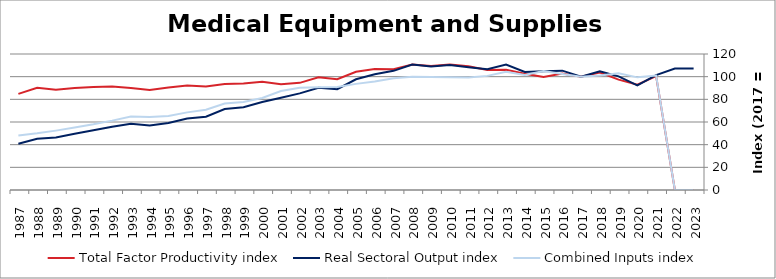
| Category | Total Factor Productivity index | Real Sectoral Output index | Combined Inputs index |
|---|---|---|---|
| 2023.0 | 0 | 107.106 | 0 |
| 2022.0 | 0 | 107.158 | 0 |
| 2021.0 | 100.472 | 101.427 | 100.951 |
| 2020.0 | 92.863 | 92.293 | 99.386 |
| 2019.0 | 97.391 | 100.265 | 102.951 |
| 2018.0 | 103.554 | 104.679 | 101.087 |
| 2017.0 | 100 | 100 | 100 |
| 2016.0 | 102.793 | 105.294 | 102.433 |
| 2015.0 | 99.797 | 104.778 | 104.992 |
| 2014.0 | 102.657 | 104.09 | 101.396 |
| 2013.0 | 106.179 | 110.677 | 104.236 |
| 2012.0 | 105.865 | 106.596 | 100.691 |
| 2011.0 | 109.169 | 108.278 | 99.184 |
| 2010.0 | 110.69 | 110.225 | 99.58 |
| 2009.0 | 109.373 | 108.951 | 99.614 |
| 2008.0 | 110.688 | 110.668 | 99.982 |
| 2007.0 | 106.644 | 105.126 | 98.577 |
| 2006.0 | 106.799 | 102.145 | 95.642 |
| 2005.0 | 104.366 | 97.725 | 93.637 |
| 2004.0 | 97.817 | 88.984 | 90.97 |
| 2003.0 | 99.468 | 90.214 | 90.696 |
| 2002.0 | 94.546 | 85.237 | 90.154 |
| 2001.0 | 93.259 | 81.404 | 87.287 |
| 2000.0 | 95.577 | 77.598 | 81.19 |
| 1999.0 | 94.074 | 73.091 | 77.695 |
| 1998.0 | 93.629 | 71.432 | 76.293 |
| 1997.0 | 91.342 | 64.682 | 70.812 |
| 1996.0 | 92.203 | 63.157 | 68.498 |
| 1995.0 | 90.44 | 59.043 | 65.284 |
| 1994.0 | 88.202 | 56.852 | 64.457 |
| 1993.0 | 89.936 | 58.37 | 64.902 |
| 1992.0 | 91.282 | 55.89 | 61.228 |
| 1991.0 | 90.78 | 52.638 | 57.984 |
| 1990.0 | 89.909 | 49.574 | 55.138 |
| 1989.0 | 88.513 | 46.371 | 52.388 |
| 1988.0 | 90.285 | 45.134 | 49.99 |
| 1987.0 | 84.833 | 40.86 | 48.166 |